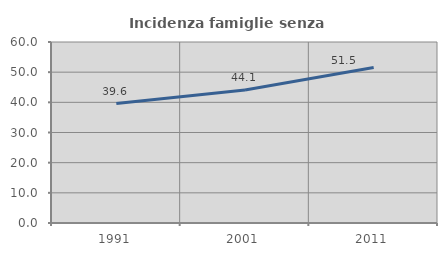
| Category | Incidenza famiglie senza nuclei |
|---|---|
| 1991.0 | 39.595 |
| 2001.0 | 44.101 |
| 2011.0 | 51.535 |